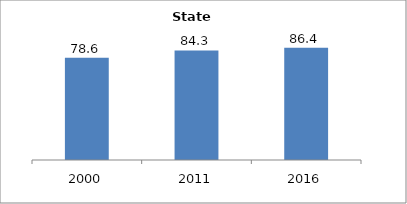
| Category | Series 0 |
|---|---|
| 2000.0 | 78.57 |
| 2011.0 | 84.3 |
| 2016.0 | 86.403 |